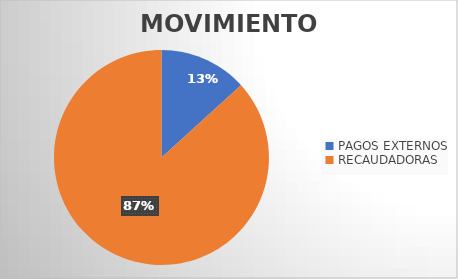
| Category | MOVIMIENTOS |
|---|---|
| PAGOS EXTERNOS | 9656 |
| RECAUDADORAS | 63213 |